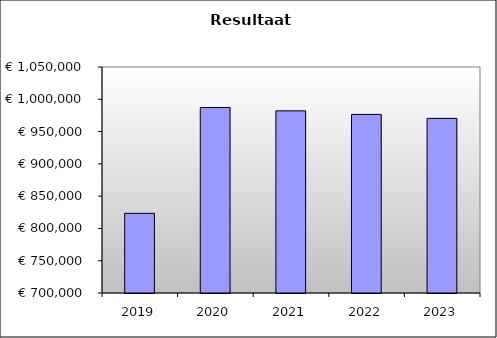
| Category | Series 0 |
|---|---|
| 2019.0 | 823375.408 |
| 2020.0 | 987214.076 |
| 2021.0 | 982105.896 |
| 2022.0 | 976528.016 |
| 2023.0 | 970485.056 |